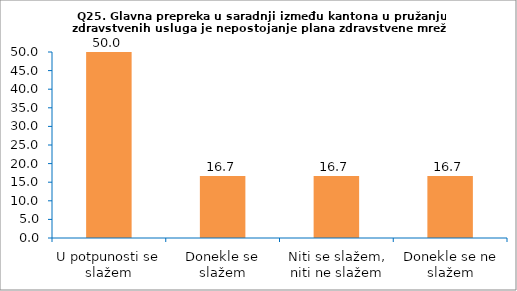
| Category | Series 0 |
|---|---|
| U potpunosti se slažem | 50 |
| Donekle se slažem | 16.667 |
| Niti se slažem, niti ne slažem | 16.667 |
| Donekle se ne slažem | 16.667 |